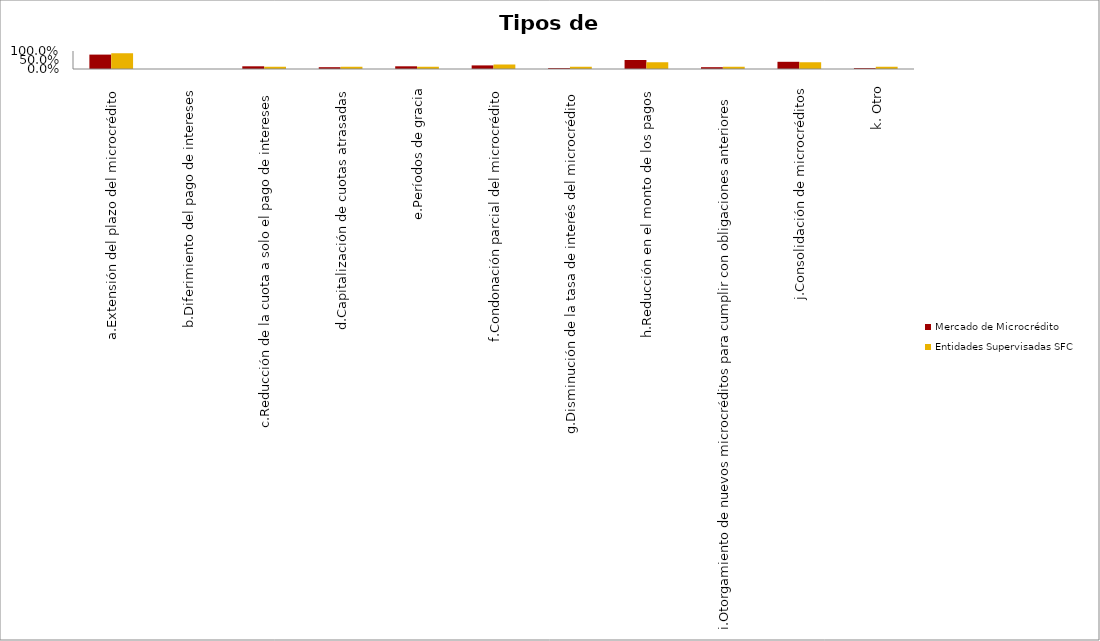
| Category | Mercado de Microcrédito | Entidades Supervisadas SFC |
|---|---|---|
| a.Extensión del plazo del microcrédito | 0.8 | 0.875 |
| b.Diferimiento del pago de intereses | 0 | 0 |
| c.Reducción de la cuota a solo el pago de intereses | 0.15 | 0.125 |
| d.Capitalización de cuotas atrasadas | 0.1 | 0.125 |
| e.Períodos de gracia | 0.15 | 0.125 |
| f.Condonación parcial del microcrédito | 0.2 | 0.25 |
| g.Disminución de la tasa de interés del microcrédito | 0.05 | 0.125 |
| h.Reducción en el monto de los pagos | 0.5 | 0.375 |
| i.Otorgamiento de nuevos microcréditos para cumplir con obligaciones anteriores | 0.1 | 0.125 |
| j.Consolidación de microcréditos | 0.4 | 0.375 |
| k. Otro | 0.05 | 0.125 |